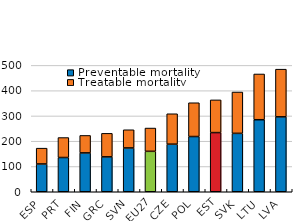
| Category | Preventable mortality | Treatable mortality |
|---|---|---|
| ESP | 109.95 | 62.55 |
| PRT | 135.48 | 79.02 |
| FIN | 153.73 | 69.09 |
| GRC | 138.06 | 93.05 |
| SVN | 173.33 | 71.98 |
| EU27 | 160 | 92.09 |
| CZE | 188.3 | 120.3 |
| POL | 218.5 | 133.69 |
| EST | 234.11 | 129.41 |
| SVK | 231.1 | 163.53 |
| LTU | 284.96 | 181.03 |
| LVA | 296.47 | 188.59 |